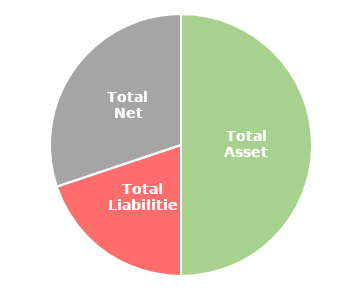
| Category | Series 0 |
|---|---|
| Total Assets | 685000 |
| Total Liabilities | -272000 |
| Total Net Worth | 413000 |